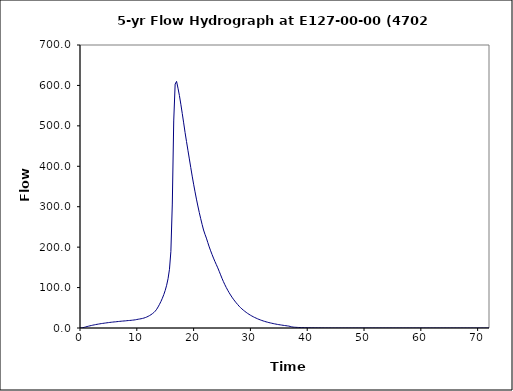
| Category | Series 0 |
|---|---|
| 0.0 | 0 |
| 0.25 | 0.2 |
| 0.5 | 0.7 |
| 0.75 | 1.6 |
| 1.0 | 2.6 |
| 1.25 | 3.6 |
| 1.5 | 4.5 |
| 1.75 | 5.4 |
| 2.0 | 6.2 |
| 2.25 | 7 |
| 2.5 | 7.7 |
| 2.75 | 8.4 |
| 3.0 | 9.1 |
| 3.25 | 9.7 |
| 3.5 | 10.3 |
| 3.75 | 10.9 |
| 4.0 | 11.4 |
| 4.25 | 11.9 |
| 4.5 | 12.4 |
| 4.75 | 12.9 |
| 5.0 | 13.3 |
| 5.25 | 13.8 |
| 5.5 | 14.2 |
| 5.75 | 14.6 |
| 6.0 | 15 |
| 6.25 | 15.3 |
| 6.5 | 15.7 |
| 6.75 | 16.1 |
| 7.0 | 16.4 |
| 7.25 | 16.8 |
| 7.5 | 17.1 |
| 7.75 | 17.4 |
| 8.0 | 17.7 |
| 8.25 | 18.1 |
| 8.5 | 18.4 |
| 8.75 | 18.7 |
| 9.0 | 19 |
| 9.25 | 19.4 |
| 9.5 | 19.8 |
| 9.75 | 20.3 |
| 10.0 | 21 |
| 10.25 | 21.7 |
| 10.5 | 22.3 |
| 10.75 | 22.9 |
| 11.0 | 23.7 |
| 11.25 | 24.6 |
| 11.5 | 25.8 |
| 11.75 | 27.2 |
| 12.0 | 28.9 |
| 12.25 | 30.8 |
| 12.5 | 33 |
| 12.75 | 35.5 |
| 13.0 | 38.3 |
| 13.25 | 41.8 |
| 13.5 | 46.4 |
| 13.75 | 52.1 |
| 14.0 | 58.6 |
| 14.25 | 65.7 |
| 14.5 | 73.6 |
| 14.75 | 82.6 |
| 15.0 | 93 |
| 15.25 | 105.7 |
| 15.5 | 121.9 |
| 15.75 | 145.3 |
| 16.0 | 189.6 |
| 16.25 | 306.6 |
| 16.5 | 512.1 |
| 16.75 | 603.3 |
| 17.0 | 610 |
| 17.25 | 593.2 |
| 17.5 | 575 |
| 17.75 | 553.5 |
| 18.0 | 530.6 |
| 18.25 | 507.4 |
| 18.5 | 483.3 |
| 18.75 | 461.2 |
| 19.0 | 439.6 |
| 19.25 | 418.2 |
| 19.5 | 396.8 |
| 19.75 | 375.7 |
| 20.0 | 355.7 |
| 20.25 | 336.8 |
| 20.5 | 318.8 |
| 20.75 | 301.8 |
| 21.0 | 285.6 |
| 21.25 | 270.4 |
| 21.5 | 256 |
| 21.75 | 242.4 |
| 22.0 | 231.8 |
| 22.25 | 222.3 |
| 22.5 | 211.2 |
| 22.75 | 200.6 |
| 23.0 | 190.9 |
| 23.25 | 181.7 |
| 23.5 | 172.9 |
| 23.75 | 164.6 |
| 24.0 | 156.7 |
| 24.25 | 148.8 |
| 24.5 | 140.3 |
| 24.75 | 131.5 |
| 25.0 | 122.8 |
| 25.25 | 114.7 |
| 25.5 | 107.1 |
| 25.75 | 100.1 |
| 26.0 | 93.5 |
| 26.25 | 87.4 |
| 26.5 | 81.7 |
| 26.75 | 76.3 |
| 27.0 | 71.3 |
| 27.25 | 66.7 |
| 27.5 | 62.3 |
| 27.75 | 58.2 |
| 28.0 | 54.1 |
| 28.25 | 50.5 |
| 28.5 | 47.3 |
| 28.75 | 44.2 |
| 29.0 | 41.4 |
| 29.25 | 38.7 |
| 29.5 | 36.2 |
| 29.75 | 33.9 |
| 30.0 | 31.7 |
| 30.25 | 29.7 |
| 30.5 | 27.8 |
| 30.75 | 26 |
| 31.0 | 24.4 |
| 31.25 | 22.8 |
| 31.5 | 21.3 |
| 31.75 | 20 |
| 32.0 | 18.7 |
| 32.25 | 17.5 |
| 32.5 | 16.4 |
| 32.75 | 15.3 |
| 33.0 | 14.4 |
| 33.25 | 13.4 |
| 33.5 | 12.6 |
| 33.75 | 11.8 |
| 34.0 | 11 |
| 34.25 | 10.3 |
| 34.5 | 9.6 |
| 34.75 | 8.9 |
| 35.0 | 8.3 |
| 35.25 | 7.8 |
| 35.5 | 7.2 |
| 35.75 | 6.7 |
| 36.0 | 6.2 |
| 36.25 | 5.7 |
| 36.5 | 5.2 |
| 36.75 | 4.7 |
| 37.0 | 3.9 |
| 37.25 | 2.9 |
| 37.5 | 2.2 |
| 37.75 | 1.9 |
| 38.0 | 1.7 |
| 38.25 | 1.5 |
| 38.5 | 1.3 |
| 38.75 | 1.2 |
| 39.0 | 1 |
| 39.25 | 0.9 |
| 39.5 | 0.8 |
| 39.75 | 0.7 |
| 40.0 | 0.6 |
| 40.25 | 0.6 |
| 40.5 | 0.5 |
| 40.75 | 0.5 |
| 41.0 | 0.4 |
| 41.25 | 0.4 |
| 41.5 | 0.3 |
| 41.75 | 0.3 |
| 42.0 | 0.3 |
| 42.25 | 0.2 |
| 42.5 | 0.2 |
| 42.75 | 0.2 |
| 43.0 | 0.1 |
| 43.25 | 0.1 |
| 43.5 | 0.1 |
| 43.75 | 0.1 |
| 44.0 | 0.1 |
| 44.25 | 0 |
| 44.5 | 0 |
| 44.75 | 0 |
| 45.0 | 0 |
| 45.25 | 0 |
| 45.5 | 0 |
| 45.75 | 0 |
| 46.0 | 0 |
| 46.25 | 0 |
| 46.5 | 0 |
| 46.75 | 0 |
| 47.0 | 0 |
| 47.25 | 0 |
| 47.5 | 0 |
| 47.75 | 0 |
| 48.0 | 0 |
| 48.25 | 0 |
| 48.5 | 0 |
| 48.75 | 0 |
| 49.0 | 0 |
| 49.25 | 0 |
| 49.5 | 0 |
| 49.75 | 0 |
| 50.0 | 0 |
| 50.25 | 0 |
| 50.5 | 0 |
| 50.75 | 0 |
| 51.0 | 0 |
| 51.25 | 0 |
| 51.5 | 0 |
| 51.75 | 0 |
| 52.0 | 0 |
| 52.25 | 0 |
| 52.5 | 0 |
| 52.75 | 0 |
| 53.0 | 0 |
| 53.25 | 0 |
| 53.5 | 0 |
| 53.75 | 0 |
| 54.0 | 0 |
| 54.25 | 0 |
| 54.5 | 0 |
| 54.75 | 0 |
| 55.0 | 0 |
| 55.25 | 0 |
| 55.5 | 0 |
| 55.75 | 0 |
| 56.0 | 0 |
| 56.25 | 0 |
| 56.5 | 0 |
| 56.75 | 0 |
| 57.0 | 0 |
| 57.25 | 0 |
| 57.5 | 0 |
| 57.75 | 0 |
| 58.0 | 0 |
| 58.25 | 0 |
| 58.5 | 0 |
| 58.75 | 0 |
| 59.0 | 0 |
| 59.25 | 0 |
| 59.5 | 0 |
| 59.75 | 0 |
| 60.0 | 0 |
| 60.25 | 0 |
| 60.5 | 0 |
| 60.75 | 0 |
| 61.0 | 0 |
| 61.25 | 0 |
| 61.5 | 0 |
| 61.75 | 0 |
| 62.0 | 0 |
| 62.25 | 0 |
| 62.5 | 0 |
| 62.75 | 0 |
| 63.0 | 0 |
| 63.25 | 0 |
| 63.5 | 0 |
| 63.75 | 0 |
| 64.0 | 0 |
| 64.25 | 0 |
| 64.5 | 0 |
| 64.75 | 0 |
| 65.0 | 0 |
| 65.25 | 0 |
| 65.5 | 0 |
| 65.75 | 0 |
| 66.0 | 0 |
| 66.25 | 0 |
| 66.5 | 0 |
| 66.75 | 0 |
| 67.0 | 0 |
| 67.25 | 0 |
| 67.5 | 0 |
| 67.75 | 0 |
| 68.0 | 0 |
| 68.25 | 0 |
| 68.5 | 0 |
| 68.75 | 0 |
| 69.0 | 0 |
| 69.25 | 0 |
| 69.5 | 0 |
| 69.75 | 0 |
| 70.0 | 0 |
| 70.25 | 0 |
| 70.5 | 0 |
| 70.75 | 0 |
| 71.0 | 0 |
| 71.25 | 0 |
| 71.5 | 0 |
| 71.75 | 0 |
| 72.0 | 0 |
| 72.25 | 0 |
| 72.5 | 0 |
| 72.75 | 0 |
| 73.0 | 0 |
| 73.25 | 0 |
| 73.5 | 0 |
| 73.75 | 0 |
| 74.0 | 0 |
| 74.25 | 0 |
| 74.5 | 0 |
| 74.75 | 0 |
| 75.0 | 0 |
| 75.25 | 0 |
| 75.5 | 0 |
| 75.75 | 0 |
| 76.0 | 0 |
| 76.25 | 0 |
| 76.5 | 0 |
| 76.75 | 0 |
| 77.0 | 0 |
| 77.25 | 0 |
| 77.5 | 0 |
| 77.75 | 0 |
| 78.0 | 0 |
| 78.25 | 0 |
| 78.5 | 0 |
| 78.75 | 0 |
| 79.0 | 0 |
| 79.25 | 0 |
| 79.5 | 0 |
| 79.75 | 0 |
| 80.0 | 0 |
| 80.25 | 0 |
| 80.5 | 0 |
| 80.75 | 0 |
| 81.0 | 0 |
| 81.25 | 0 |
| 81.5 | 0 |
| 81.75 | 0 |
| 82.0 | 0 |
| 82.25 | 0 |
| 82.5 | 0 |
| 82.75 | 0 |
| 83.0 | 0 |
| 83.25 | 0 |
| 83.5 | 0 |
| 83.75 | 0 |
| 84.0 | 0 |
| 84.25 | 0 |
| 84.5 | 0 |
| 84.75 | 0 |
| 85.0 | 0 |
| 85.25 | 0 |
| 85.5 | 0 |
| 85.75 | 0 |
| 86.0 | 0 |
| 86.25 | 0 |
| 86.5 | 0 |
| 86.75 | 0 |
| 87.0 | 0 |
| 87.25 | 0 |
| 87.5 | 0 |
| 87.75 | 0 |
| 88.0 | 0 |
| 88.25 | 0 |
| 88.5 | 0 |
| 88.75 | 0 |
| 89.0 | 0 |
| 89.25 | 0 |
| 89.5 | 0 |
| 89.75 | 0 |
| 90.0 | 0 |
| 90.25 | 0 |
| 90.5 | 0 |
| 90.75 | 0 |
| 91.0 | 0 |
| 91.25 | 0 |
| 91.5 | 0 |
| 91.75 | 0 |
| 92.0 | 0 |
| 92.25 | 0 |
| 92.5 | 0 |
| 92.75 | 0 |
| 93.0 | 0 |
| 93.25 | 0 |
| 93.5 | 0 |
| 93.75 | 0 |
| 94.0 | 0 |
| 94.25 | 0 |
| 94.5 | 0 |
| 94.75 | 0 |
| 95.0 | 0 |
| 95.25 | 0 |
| 95.5 | 0 |
| 95.75 | 0 |
| 96.0 | 0 |
| 96.25 | 0 |
| 96.5 | 0 |
| 96.75 | 0 |
| 97.0 | 0 |
| 97.25 | 0 |
| 97.5 | 0 |
| 97.75 | 0 |
| 98.0 | 0 |
| 98.25 | 0 |
| 98.5 | 0 |
| 98.75 | 0 |
| 99.0 | 0 |
| 99.25 | 0 |
| 99.5 | 0 |
| 99.75 | 0 |
| 100.0 | 0 |
| 100.25 | 0 |
| 100.5 | 0 |
| 100.75 | 0 |
| 101.0 | 0 |
| 101.25 | 0 |
| 101.5 | 0 |
| 101.75 | 0 |
| 102.0 | 0 |
| 102.25 | 0 |
| 102.5 | 0 |
| 102.75 | 0 |
| 103.0 | 0 |
| 103.25 | 0 |
| 103.5 | 0 |
| 103.75 | 0 |
| 104.0 | 0 |
| 104.25 | 0 |
| 104.5 | 0 |
| 104.75 | 0 |
| 105.0 | 0 |
| 105.25 | 0 |
| 105.5 | 0 |
| 105.75 | 0 |
| 106.0 | 0 |
| 106.25 | 0 |
| 106.5 | 0 |
| 106.75 | 0 |
| 107.0 | 0 |
| 107.25 | 0 |
| 107.5 | 0 |
| 107.75 | 0 |
| 108.0 | 0 |
| 108.25 | 0 |
| 108.5 | 0 |
| 108.75 | 0 |
| 109.0 | 0 |
| 109.25 | 0 |
| 109.5 | 0 |
| 109.75 | 0 |
| 110.0 | 0 |
| 110.25 | 0 |
| 110.5 | 0 |
| 110.75 | 0 |
| 111.0 | 0 |
| 111.25 | 0 |
| 111.5 | 0 |
| 111.75 | 0 |
| 112.0 | 0 |
| 112.25 | 0 |
| 112.5 | 0 |
| 112.75 | 0 |
| 113.0 | 0 |
| 113.25 | 0 |
| 113.5 | 0 |
| 113.75 | 0 |
| 114.0 | 0 |
| 114.25 | 0 |
| 114.5 | 0 |
| 114.75 | 0 |
| 115.0 | 0 |
| 115.25 | 0 |
| 115.5 | 0 |
| 115.75 | 0 |
| 116.0 | 0 |
| 116.25 | 0 |
| 116.5 | 0 |
| 116.75 | 0 |
| 117.0 | 0 |
| 117.25 | 0 |
| 117.5 | 0 |
| 117.75 | 0 |
| 118.0 | 0 |
| 118.25 | 0 |
| 118.5 | 0 |
| 118.75 | 0 |
| 119.0 | 0 |
| 119.25 | 0 |
| 119.5 | 0 |
| 119.75 | 0 |
| 120.0 | 0 |
| 120.25 | 0 |
| 120.5 | 0 |
| 120.75 | 0 |
| 121.0 | 0 |
| 121.25 | 0 |
| 121.5 | 0 |
| 121.75 | 0 |
| 122.0 | 0 |
| 122.25 | 0 |
| 122.5 | 0 |
| 122.75 | 0 |
| 123.0 | 0 |
| 123.25 | 0 |
| 123.5 | 0 |
| 123.75 | 0 |
| 124.0 | 0 |
| 124.25 | 0 |
| 124.5 | 0 |
| 124.75 | 0 |
| 125.0 | 0 |
| 125.25 | 0 |
| 125.5 | 0 |
| 125.75 | 0 |
| 126.0 | 0 |
| 126.25 | 0 |
| 126.5 | 0 |
| 126.75 | 0 |
| 127.0 | 0 |
| 127.25 | 0 |
| 127.5 | 0 |
| 127.75 | 0 |
| 128.0 | 0 |
| 128.25 | 0 |
| 128.5 | 0 |
| 128.75 | 0 |
| 129.0 | 0 |
| 129.25 | 0 |
| 129.5 | 0 |
| 129.75 | 0 |
| 130.0 | 0 |
| 130.25 | 0 |
| 130.5 | 0 |
| 130.75 | 0 |
| 131.0 | 0 |
| 131.25 | 0 |
| 131.5 | 0 |
| 131.75 | 0 |
| 132.0 | 0 |
| 132.25 | 0 |
| 132.5 | 0 |
| 132.75 | 0 |
| 133.0 | 0 |
| 133.25 | 0 |
| 133.5 | 0 |
| 133.75 | 0 |
| 134.0 | 0 |
| 134.25 | 0 |
| 134.5 | 0 |
| 134.75 | 0 |
| 135.0 | 0 |
| 135.25 | 0 |
| 135.5 | 0 |
| 135.75 | 0 |
| 136.0 | 0 |
| 136.25 | 0 |
| 136.5 | 0 |
| 136.75 | 0 |
| 137.0 | 0 |
| 137.25 | 0 |
| 137.5 | 0 |
| 137.75 | 0 |
| 138.0 | 0 |
| 138.25 | 0 |
| 138.5 | 0 |
| 138.75 | 0 |
| 139.0 | 0 |
| 139.25 | 0 |
| 139.5 | 0 |
| 139.75 | 0 |
| 140.0 | 0 |
| 140.25 | 0 |
| 140.5 | 0 |
| 140.75 | 0 |
| 141.0 | 0 |
| 141.25 | 0 |
| 141.5 | 0 |
| 141.75 | 0 |
| 142.0 | 0 |
| 142.25 | 0 |
| 142.5 | 0 |
| 142.75 | 0 |
| 143.0 | 0 |
| 143.25 | 0 |
| 143.5 | 0 |
| 143.75 | 0 |
| 144.0 | 0 |
| 144.25 | 0 |
| 144.5 | 0 |
| 144.75 | 0 |
| 145.0 | 0 |
| 145.25 | 0 |
| 145.5 | 0 |
| 145.75 | 0 |
| 146.0 | 0 |
| 146.25 | 0 |
| 146.5 | 0 |
| 146.75 | 0 |
| 147.0 | 0 |
| 147.25 | 0 |
| 147.5 | 0 |
| 147.75 | 0 |
| 148.0 | 0 |
| 148.25 | 0 |
| 148.5 | 0 |
| 148.75 | 0 |
| 149.0 | 0 |
| 149.25 | 0 |
| 149.5 | 0 |
| 149.75 | 0 |
| 150.0 | 0 |
| 150.25 | 0 |
| 150.5 | 0 |
| 150.75 | 0 |
| 151.0 | 0 |
| 151.25 | 0 |
| 151.5 | 0 |
| 151.75 | 0 |
| 152.0 | 0 |
| 152.25 | 0 |
| 152.5 | 0 |
| 152.75 | 0 |
| 153.0 | 0 |
| 153.25 | 0 |
| 153.5 | 0 |
| 153.75 | 0 |
| 154.0 | 0 |
| 154.25 | 0 |
| 154.5 | 0 |
| 154.75 | 0 |
| 155.0 | 0 |
| 155.25 | 0 |
| 155.5 | 0 |
| 155.75 | 0 |
| 156.0 | 0 |
| 156.25 | 0 |
| 156.5 | 0 |
| 156.75 | 0 |
| 157.0 | 0 |
| 157.25 | 0 |
| 157.5 | 0 |
| 157.75 | 0 |
| 158.0 | 0 |
| 158.25 | 0 |
| 158.5 | 0 |
| 158.75 | 0 |
| 159.0 | 0 |
| 159.25 | 0 |
| 159.5 | 0 |
| 159.75 | 0 |
| 160.0 | 0 |
| 160.25 | 0 |
| 160.5 | 0 |
| 160.75 | 0 |
| 161.0 | 0 |
| 161.25 | 0 |
| 161.5 | 0 |
| 161.75 | 0 |
| 162.0 | 0 |
| 162.25 | 0 |
| 162.5 | 0 |
| 162.75 | 0 |
| 163.0 | 0 |
| 163.25 | 0 |
| 163.5 | 0 |
| 163.75 | 0 |
| 164.0 | 0 |
| 164.25 | 0 |
| 164.5 | 0 |
| 164.75 | 0 |
| 165.0 | 0 |
| 165.25 | 0 |
| 165.5 | 0 |
| 165.75 | 0 |
| 166.0 | 0 |
| 166.25 | 0 |
| 166.5 | 0 |
| 166.75 | 0 |
| 167.0 | 0 |
| 167.25 | 0 |
| 167.5 | 0 |
| 167.75 | 0 |
| 168.0 | 0 |
| 168.25 | 0 |
| 168.5 | 0 |
| 168.75 | 0 |
| 169.0 | 0 |
| 169.25 | 0 |
| 169.5 | 0 |
| 169.75 | 0 |
| 170.0 | 0 |
| 170.25 | 0 |
| 170.5 | 0 |
| 170.75 | 0 |
| 171.0 | 0 |
| 171.25 | 0 |
| 171.5 | 0 |
| 171.75 | 0 |
| 172.0 | 0 |
| 172.25 | 0 |
| 172.5 | 0 |
| 172.75 | 0 |
| 173.0 | 0 |
| 173.25 | 0 |
| 173.5 | 0 |
| 173.75 | 0 |
| 174.0 | 0 |
| 174.25 | 0 |
| 174.5 | 0 |
| 174.75 | 0 |
| 175.0 | 0 |
| 175.25 | 0 |
| 175.5 | 0 |
| 175.75 | 0 |
| 176.0 | 0 |
| 176.25 | 0 |
| 176.5 | 0 |
| 176.75 | 0 |
| 177.0 | 0 |
| 177.25 | 0 |
| 177.5 | 0 |
| 177.75 | 0 |
| 178.0 | 0 |
| 178.25 | 0 |
| 178.5 | 0 |
| 178.75 | 0 |
| 179.0 | 0 |
| 179.25 | 0 |
| 179.5 | 0 |
| 179.75 | 0 |
| 180.0 | 0 |
| 180.25 | 0 |
| 180.5 | 0 |
| 180.75 | 0 |
| 181.0 | 0 |
| 181.25 | 0 |
| 181.5 | 0 |
| 181.75 | 0 |
| 182.0 | 0 |
| 182.25 | 0 |
| 182.5 | 0 |
| 182.75 | 0 |
| 183.0 | 0 |
| 183.25 | 0 |
| 183.5 | 0 |
| 183.75 | 0 |
| 184.0 | 0 |
| 184.25 | 0 |
| 184.5 | 0 |
| 184.75 | 0 |
| 185.0 | 0 |
| 185.25 | 0 |
| 185.5 | 0 |
| 185.75 | 0 |
| 186.0 | 0 |
| 186.25 | 0 |
| 186.5 | 0 |
| 186.75 | 0 |
| 187.0 | 0 |
| 187.25 | 0 |
| 187.5 | 0 |
| 187.75 | 0 |
| 188.0 | 0 |
| 188.25 | 0 |
| 188.5 | 0 |
| 188.75 | 0 |
| 189.0 | 0 |
| 189.25 | 0 |
| 189.5 | 0 |
| 189.75 | 0 |
| 190.0 | 0 |
| 190.25 | 0 |
| 190.5 | 0 |
| 190.75 | 0 |
| 191.0 | 0 |
| 191.25 | 0 |
| 191.5 | 0 |
| 191.75 | 0 |